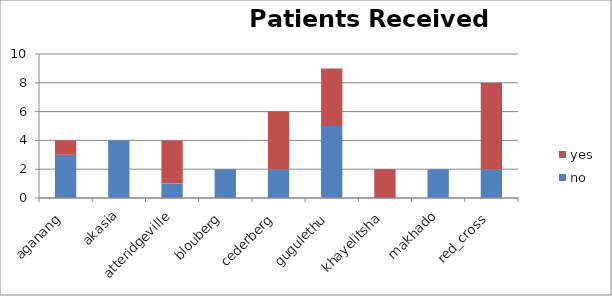
| Category | no | yes |
|---|---|---|
| aganang | 3 | 1 |
| akasia | 4 | 0 |
| atteridgeville | 1 | 3 |
| blouberg | 2 | 0 |
| cederberg | 2 | 4 |
| gugulethu | 5 | 4 |
| khayelitsha | 0 | 2 |
| makhado | 2 | 0 |
| red_cross | 2 | 6 |